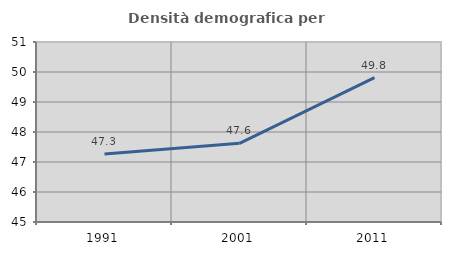
| Category | Densità demografica |
|---|---|
| 1991.0 | 47.266 |
| 2001.0 | 47.621 |
| 2011.0 | 49.81 |